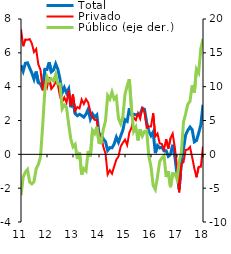
| Category | Total | Privado |
|---|---|---|
| 2011-01-01 | 5.272 | 7.395 |
| 2011-02-01 | 4.915 | 6.392 |
| 2011-03-01 | 5.381 | 6.788 |
| 2011-04-01 | 5.409 | 6.766 |
| 2011-05-01 | 5.106 | 6.814 |
| 2011-06-01 | 4.807 | 6.551 |
| 2011-07-01 | 4.44 | 6.046 |
| 2011-08-01 | 4.895 | 6.225 |
| 2011-09-01 | 4.238 | 5.312 |
| 2011-10-01 | 4.162 | 4.998 |
| 2011-11-01 | 3.851 | 3.782 |
| 2011-12-01 | 5.023 | 4.288 |
| 2012-01-01 | 5.017 | 3.959 |
| 2012-02-01 | 5.438 | 4.564 |
| 2012-03-01 | 4.874 | 3.867 |
| 2012-04-01 | 4.984 | 4.03 |
| 2012-05-01 | 5.35 | 4.277 |
| 2012-06-01 | 5.035 | 4.118 |
| 2012-07-01 | 4.439 | 3.416 |
| 2012-08-01 | 3.632 | 3.094 |
| 2012-09-01 | 3.946 | 3.364 |
| 2012-10-01 | 3.635 | 3.054 |
| 2012-11-01 | 3.874 | 3.77 |
| 2012-12-01 | 2.783 | 2.872 |
| 2013-01-01 | 3.175 | 3.537 |
| 2013-02-01 | 2.406 | 2.567 |
| 2013-03-01 | 2.284 | 2.794 |
| 2013-04-01 | 2.366 | 2.718 |
| 2013-05-01 | 2.292 | 3.235 |
| 2013-06-01 | 2.197 | 2.977 |
| 2013-07-01 | 2.377 | 3.263 |
| 2013-08-01 | 2.666 | 3.058 |
| 2013-09-01 | 2.084 | 2.528 |
| 2013-10-01 | 2.393 | 2.185 |
| 2013-11-01 | 2.197 | 2.038 |
| 2013-12-01 | 2.332 | 2.027 |
| 2014-01-01 | 1.201 | 1.11 |
| 2014-02-01 | 1.187 | 1.104 |
| 2014-03-01 | 0.91 | 0.446 |
| 2014-04-01 | 0.751 | 0.044 |
| 2014-05-01 | 0.231 | -1.189 |
| 2014-06-01 | 0.396 | -0.942 |
| 2014-07-01 | 0.384 | -1.144 |
| 2014-08-01 | 0.61 | -0.718 |
| 2014-09-01 | 1.016 | -0.31 |
| 2014-10-01 | 0.712 | -0.127 |
| 2014-11-01 | 1.082 | 0.458 |
| 2014-12-01 | 1.424 | 0.685 |
| 2015-01-01 | 2.044 | 0.869 |
| 2015-02-01 | 1.951 | 0.554 |
| 2015-03-01 | 2.718 | 1.281 |
| 2015-04-01 | 2.344 | 1.57 |
| 2015-05-01 | 2.372 | 2.184 |
| 2015-06-01 | 2.336 | 2.022 |
| 2015-07-01 | 2.371 | 2.431 |
| 2015-08-01 | 2.364 | 2.108 |
| 2015-09-01 | 2.722 | 2.724 |
| 2015-10-01 | 2.661 | 2.518 |
| 2015-11-01 | 1.881 | 1.585 |
| 2015-12-01 | 1.353 | 1.653 |
| 2016-01-01 | 1.103 | 1.649 |
| 2016-02-01 | 1.322 | 2.429 |
| 2016-03-01 | 0.073 | 1.062 |
| 2016-04-01 | 0.52 | 1.23 |
| 2016-05-01 | 0.38 | 0.649 |
| 2016-06-01 | 0.429 | 0.616 |
| 2016-07-01 | 0.205 | 0.282 |
| 2016-08-01 | 0.207 | 0.898 |
| 2016-09-01 | -0.119 | 0.336 |
| 2016-10-01 | -0.005 | 0.942 |
| 2016-11-01 | 0.566 | 1.22 |
| 2016-12-01 | -0.109 | 0.405 |
| 2017-01-01 | -1.181 | -0.741 |
| 2017-02-01 | -2.08 | -2.25 |
| 2017-03-01 | -0.435 | -0.554 |
| 2017-04-01 | 0.328 | -0.463 |
| 2017-05-01 | 1.158 | 0.265 |
| 2017-06-01 | 1.42 | 0.282 |
| 2017-07-01 | 1.613 | 0.434 |
| 2017-08-01 | 1.456 | -0.17 |
| 2017-09-01 | 0.736 | -0.828 |
| 2017-10-01 | 0.816 | -1.356 |
| 2017-11-01 | 1.252 | -0.742 |
| 2017-12-01 | 1.749 | -0.735 |
| 2018-01-01 | 2.932 | 0.465 |